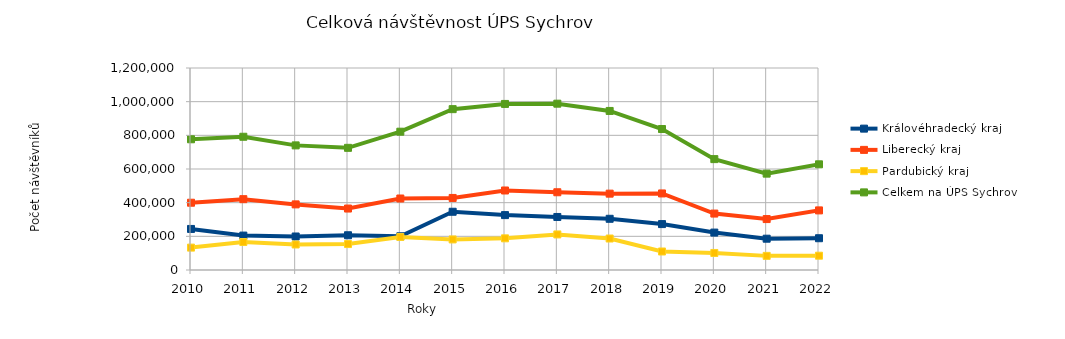
| Category | Královéhradecký kraj | Liberecký kraj | Pardubický kraj | Celkem na ÚPS Sychrov |
|---|---|---|---|---|
| 2010.0 | 243910 | 399672 | 133004 | 776586 |
| 2011.0 | 204481 | 420780 | 166238 | 791499 |
| 2012.0 | 199025 | 389781 | 151509 | 740315 |
| 2013.0 | 206419 | 365108 | 154165 | 725692 |
| 2014.0 | 200438 | 424718 | 196473 | 821629 |
| 2015.0 | 345970 | 428023 | 181567 | 955560 |
| 2016.0 | 326137 | 472318 | 188108 | 986563 |
| 2017.0 | 314983 | 461803 | 211268 | 988054 |
| 2018.0 | 304267 | 453568 | 187017 | 944852 |
| 2019.0 | 272720 | 454785 | 109949 | 837454 |
| 2020.0 | 222238 | 335261 | 101211 | 658710 |
| 2021.0 | 185934 | 302574 | 83925 | 572433 |
| 2022.0 | 188794 | 354031 | 85002 | 627827 |